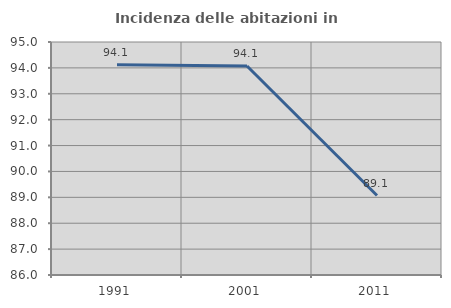
| Category | Incidenza delle abitazioni in proprietà  |
|---|---|
| 1991.0 | 94.118 |
| 2001.0 | 94.071 |
| 2011.0 | 89.069 |